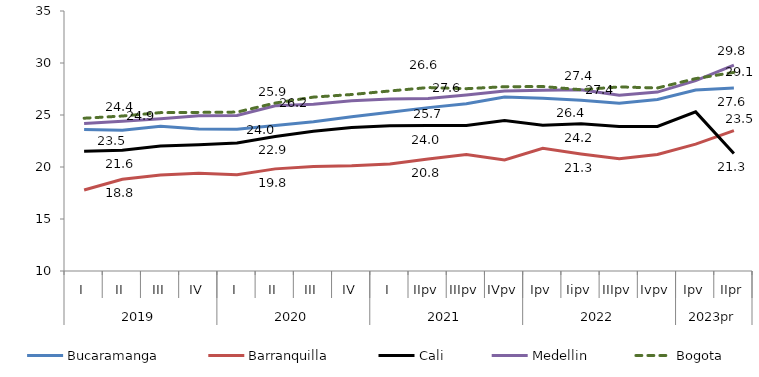
| Category | Bucaramanga | Barranquilla | Cali | Medellin | Bogota |
|---|---|---|---|---|---|
| 0 | 23.61 | 17.79 | 21.51 | 24.19 | 24.69 |
| 1 | 23.53 | 18.82 | 21.6 | 24.41 | 24.9 |
| 2 | 23.91 | 19.22 | 22.01 | 24.64 | 25.23 |
| 3 | 23.65 | 19.4 | 22.13 | 24.92 | 25.25 |
| 4 | 23.63 | 19.26 | 22.3 | 24.95 | 25.28 |
| 5 | 23.98 | 19.82 | 22.94 | 25.88 | 26.15 |
| 6 | 24.36 | 20.05 | 23.43 | 26.03 | 26.72 |
| 7 | 24.83 | 20.11 | 23.79 | 26.38 | 26.97 |
| 8 | 25.26 | 20.3 | 23.97 | 26.55 | 27.31 |
| 9 | 25.71 | 20.77 | 23.98 | 26.59 | 27.64 |
| 10 | 26.08 | 21.19 | 24 | 26.93 | 27.53 |
| 11 | 26.74 | 20.67 | 24.47 | 27.31 | 27.72 |
| 12 | 26.61 | 21.8 | 24.02 | 27.37 | 27.74 |
| 13 | 26.41 | 21.26 | 24.17 | 27.42 | 27.43 |
| 14 | 26.12 | 20.8 | 23.9 | 26.9 | 27.7 |
| 15 | 26.5 | 21.2 | 23.9 | 27.2 | 27.6 |
| 16 | 27.4 | 22.2 | 25.3 | 28.3 | 28.5 |
| 17 | 27.6 | 23.5 | 21.3 | 29.8 | 29.1 |